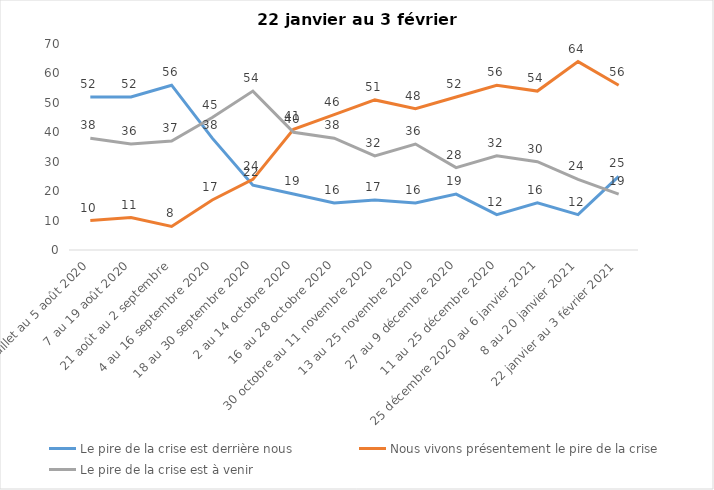
| Category | Le pire de la crise est derrière nous | Nous vivons présentement le pire de la crise | Le pire de la crise est à venir |
|---|---|---|---|
| 24 juillet au 5 août 2020 | 52 | 10 | 38 |
| 7 au 19 août 2020 | 52 | 11 | 36 |
| 21 août au 2 septembre | 56 | 8 | 37 |
| 4 au 16 septembre 2020 | 38 | 17 | 45 |
| 18 au 30 septembre 2020 | 22 | 24 | 54 |
| 2 au 14 octobre 2020 | 19 | 41 | 40 |
| 16 au 28 octobre 2020 | 16 | 46 | 38 |
| 30 octobre au 11 novembre 2020 | 17 | 51 | 32 |
| 13 au 25 novembre 2020 | 16 | 48 | 36 |
| 27 au 9 décembre 2020 | 19 | 52 | 28 |
| 11 au 25 décembre 2020 | 12 | 56 | 32 |
| 25 décembre 2020 au 6 janvier 2021 | 16 | 54 | 30 |
| 8 au 20 janvier 2021 | 12 | 64 | 24 |
| 22 janvier au 3 février 2021 | 25 | 56 | 19 |